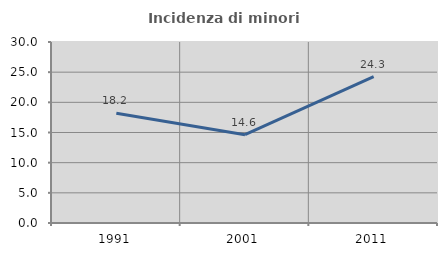
| Category | Incidenza di minori stranieri |
|---|---|
| 1991.0 | 18.182 |
| 2001.0 | 14.634 |
| 2011.0 | 24.265 |